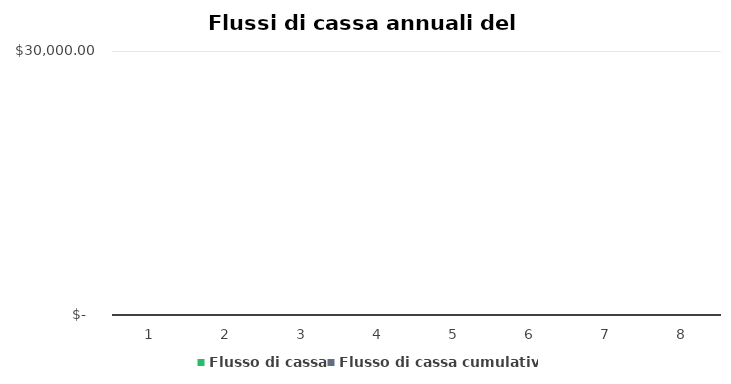
| Category | Flusso di cassa | Flusso di cassa cumulativo | Series 2 |
|---|---|---|---|
| 0 | 0 | 0 | 1 |
| 1 | 0 | 0 | 2 |
| 2 | 0 | 0 | 3 |
| 3 | 0 | 0 | 4 |
| 4 | 0 | 0 | 5 |
| 5 | 0 | 0 | 6 |
| 6 | 0 | 0 | 7 |
| 7 | 0 | 0 | 8 |